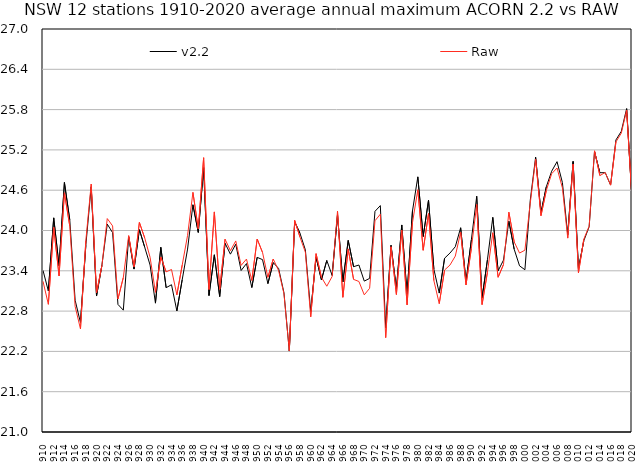
| Category | v2.2 | Raw |
|---|---|---|
| 1910 | 23.406 | 23.243 |
| 1911 | 23.1 | 22.901 |
| 1912 | 24.188 | 24.047 |
| 1913 | 23.474 | 23.324 |
| 1914 | 24.715 | 24.561 |
| 1915 | 24.157 | 24.065 |
| 1916 | 22.962 | 22.87 |
| 1917 | 22.63 | 22.534 |
| 1918 | 23.78 | 23.85 |
| 1919 | 24.651 | 24.691 |
| 1920 | 23.025 | 23.073 |
| 1921 | 23.481 | 23.477 |
| 1922 | 24.095 | 24.178 |
| 1923 | 23.968 | 24.069 |
| 1924 | 22.899 | 22.98 |
| 1925 | 22.814 | 23.3 |
| 1926 | 23.904 | 23.923 |
| 1927 | 23.426 | 23.46 |
| 1928 | 24.012 | 24.12 |
| 1929 | 23.749 | 23.888 |
| 1930 | 23.486 | 23.601 |
| 1931 | 22.918 | 23.079 |
| 1932 | 23.75 | 23.606 |
| 1933 | 23.149 | 23.384 |
| 1934 | 23.193 | 23.42 |
| 1935 | 22.803 | 23.042 |
| 1936 | 23.268 | 23.485 |
| 1937 | 23.723 | 23.928 |
| 1938 | 24.383 | 24.568 |
| 1939 | 23.971 | 24.023 |
| 1940 | 24.936 | 25.083 |
| 1941 | 23.031 | 23.122 |
| 1942 | 23.638 | 24.277 |
| 1943 | 23.017 | 23.126 |
| 1944 | 23.811 | 23.871 |
| 1945 | 23.648 | 23.699 |
| 1946 | 23.796 | 23.845 |
| 1947 | 23.404 | 23.48 |
| 1948 | 23.508 | 23.575 |
| 1949 | 23.151 | 23.256 |
| 1950 | 23.6 | 23.873 |
| 1951 | 23.566 | 23.672 |
| 1952 | 23.209 | 23.302 |
| 1953 | 23.522 | 23.576 |
| 1954 | 23.435 | 23.403 |
| 1955 | 23.073 | 23.059 |
| 1956 | 22.205 | 22.209 |
| 1957 | 24.129 | 24.151 |
| 1958 | 23.957 | 23.899 |
| 1959 | 23.712 | 23.677 |
| 1960 | 22.792 | 22.715 |
| 1961 | 23.603 | 23.655 |
| 1962 | 23.264 | 23.304 |
| 1963 | 23.554 | 23.17 |
| 1964 | 23.331 | 23.316 |
| 1965 | 24.234 | 24.288 |
| 1966 | 23.234 | 23.006 |
| 1967 | 23.852 | 23.726 |
| 1968 | 23.461 | 23.272 |
| 1969 | 23.486 | 23.241 |
| 1970 | 23.246 | 23.042 |
| 1971 | 23.287 | 23.14 |
| 1972 | 24.285 | 24.145 |
| 1973 | 24.371 | 24.243 |
| 1974 | 22.548 | 22.405 |
| 1975 | 23.779 | 23.757 |
| 1976 | 23.126 | 23.047 |
| 1977 | 24.082 | 24.005 |
| 1978 | 23.05 | 22.893 |
| 1979 | 24.289 | 24.116 |
| 1980 | 24.799 | 24.607 |
| 1981 | 23.91 | 23.706 |
| 1982 | 24.451 | 24.253 |
| 1983 | 23.423 | 23.254 |
| 1984 | 23.068 | 22.911 |
| 1985 | 23.587 | 23.411 |
| 1986 | 23.664 | 23.485 |
| 1987 | 23.759 | 23.619 |
| 1988 | 24.041 | 23.975 |
| 1989 | 23.235 | 23.189 |
| 1990 | 23.861 | 23.734 |
| 1991 | 24.51 | 24.387 |
| 1992 | 22.994 | 22.897 |
| 1993 | 23.564 | 23.378 |
| 1994 | 24.196 | 23.967 |
| 1995 | 23.4 | 23.304 |
| 1996 | 23.559 | 23.494 |
| 1997 | 24.139 | 24.273 |
| 1998 | 23.721 | 23.83 |
| 1999 | 23.474 | 23.664 |
| 2000 | 23.416 | 23.707 |
| 2001 | 24.45 | 24.407 |
| 2002 | 25.091 | 25.062 |
| 2003 | 24.266 | 24.221 |
| 2004 | 24.651 | 24.597 |
| 2005 | 24.883 | 24.846 |
| 2006 | 25.025 | 24.93 |
| 2007 | 24.714 | 24.635 |
| 2008 | 23.936 | 23.887 |
| 2009 | 25.029 | 24.988 |
| 2010 | 23.432 | 23.37 |
| 2011 | 23.847 | 23.871 |
| 2012 | 24.057 | 24.064 |
| 2013 | 25.175 | 25.186 |
| 2014 | 24.86 | 24.817 |
| 2015 | 24.861 | 24.864 |
| 2016 | 24.677 | 24.675 |
| 2017 | 25.348 | 25.319 |
| 2018 | 25.476 | 25.449 |
| 2019 | 25.815 | 25.792 |
| 2020 | 24.47 | 24.468 |